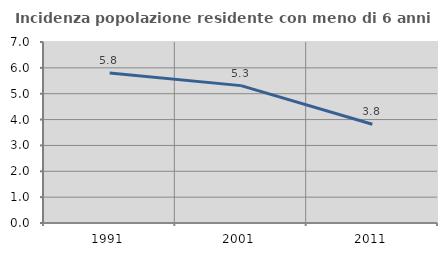
| Category | Incidenza popolazione residente con meno di 6 anni |
|---|---|
| 1991.0 | 5.8 |
| 2001.0 | 5.313 |
| 2011.0 | 3.82 |